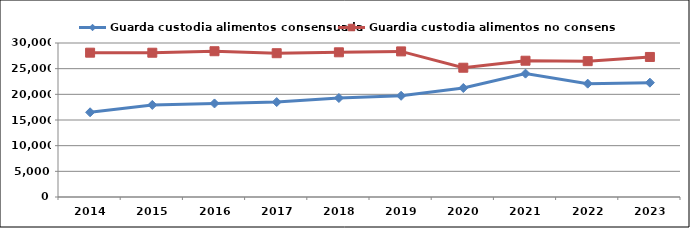
| Category | Guarda custodia alimentos consensuada | Guardia custodia alimentos no consensuada |
|---|---|---|
| 2014.0 | 16502 | 28114 |
| 2015.0 | 17932 | 28104 |
| 2016.0 | 18225 | 28398 |
| 2017.0 | 18492 | 28011 |
| 2018.0 | 19281 | 28188 |
| 2019.0 | 19716 | 28364 |
| 2020.0 | 21236 | 25184 |
| 2021.0 | 24032 | 26548 |
| 2022.0 | 22077 | 26466 |
| 2023.0 | 22273 | 27280 |